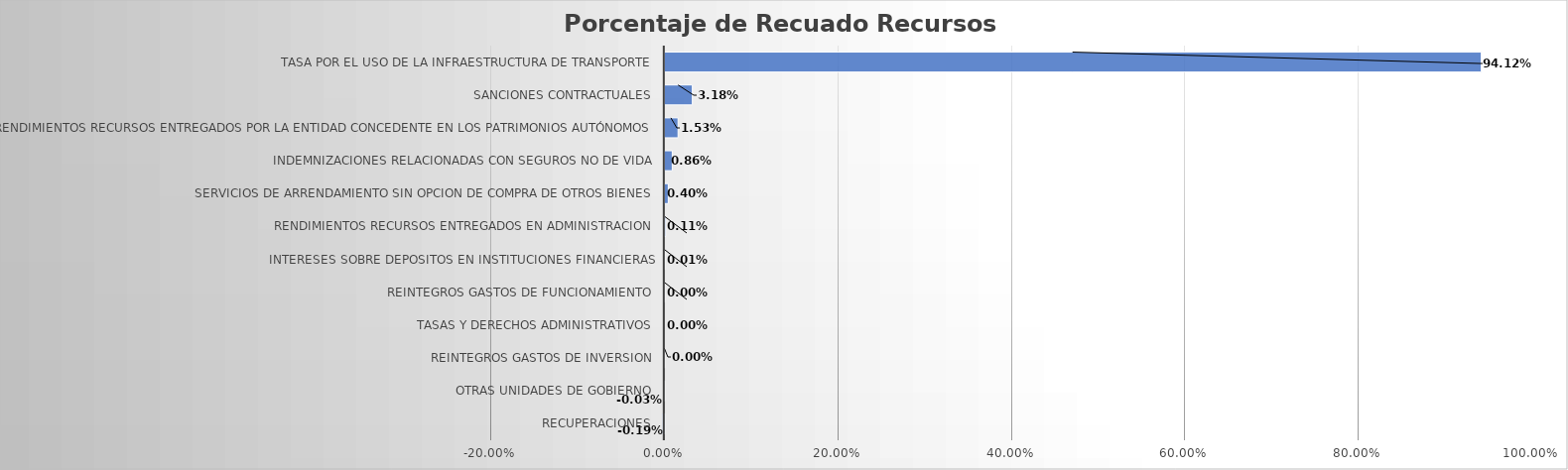
| Category | Total |
|---|---|
| RECUPERACIONES | -0.002 |
| OTRAS UNIDADES DE GOBIERNO | 0 |
| REINTEGROS GASTOS DE INVERSION | 0 |
| TASAS Y DERECHOS ADMINISTRATIVOS | 0 |
| REINTEGROS GASTOS DE FUNCIONAMIENTO | 0 |
| INTERESES SOBRE DEPOSITOS EN INSTITUCIONES FINANCIERAS | 0 |
| RENDIMIENTOS RECURSOS ENTREGADOS EN ADMINISTRACION | 0.001 |
| SERVICIOS DE ARRENDAMIENTO SIN OPCION DE COMPRA DE OTROS BIENES | 0.004 |
| INDEMNIZACIONES RELACIONADAS CON SEGUROS NO DE VIDA | 0.009 |
| RENDIMIENTOS RECURSOS ENTREGADOS POR LA ENTIDAD CONCEDENTE EN LOS PATRIMONIOS AUTÓNOMOS | 0.015 |
| SANCIONES CONTRACTUALES | 0.032 |
| TASA POR EL USO DE LA INFRAESTRUCTURA DE TRANSPORTE | 0.941 |